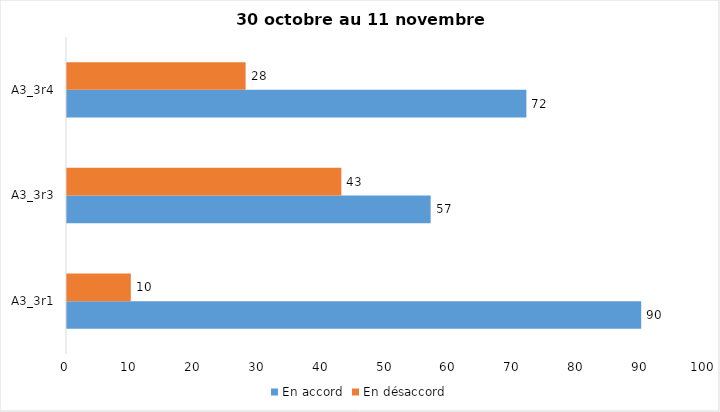
| Category | En accord | En désaccord |
|---|---|---|
| A3_3r1 | 90 | 10 |
| A3_3r3 | 57 | 43 |
| A3_3r4 | 72 | 28 |